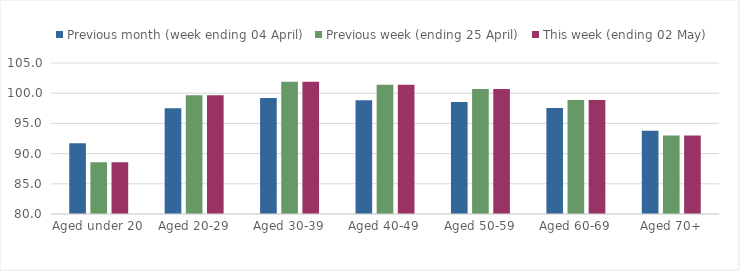
| Category | Previous month (week ending 04 April) | Previous week (ending 25 April) | This week (ending 02 May) |
|---|---|---|---|
| Aged under 20 | 91.706 | 88.547 | 88.547 |
| Aged 20-29 | 97.508 | 99.646 | 99.646 |
| Aged 30-39 | 99.193 | 101.906 | 101.906 |
| Aged 40-49 | 98.848 | 101.397 | 101.397 |
| Aged 50-59 | 98.534 | 100.678 | 100.678 |
| Aged 60-69 | 97.566 | 98.869 | 98.869 |
| Aged 70+ | 93.804 | 92.996 | 92.996 |